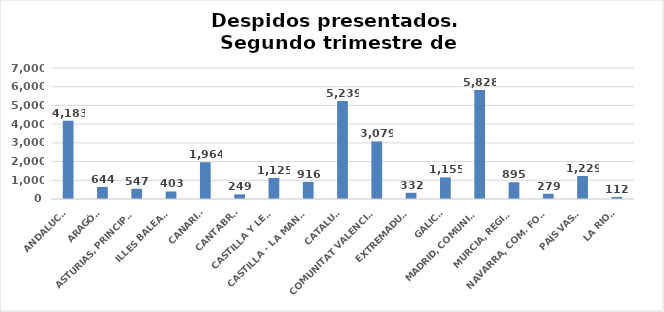
| Category | Series 0 |
|---|---|
| ANDALUCÍA | 4183 |
| ARAGÓN | 644 |
| ASTURIAS, PRINCIPADO | 547 |
| ILLES BALEARS | 403 |
| CANARIAS | 1964 |
| CANTABRIA | 249 |
| CASTILLA Y LEÓN | 1125 |
| CASTILLA - LA MANCHA | 916 |
| CATALUÑA | 5239 |
| COMUNITAT VALENCIANA | 3079 |
| EXTREMADURA | 332 |
| GALICIA | 1155 |
| MADRID, COMUNIDAD | 5828 |
| MURCIA, REGIÓN | 895 |
| NAVARRA, COM. FORAL | 279 |
| PAÍS VASCO | 1229 |
| LA RIOJA | 112 |